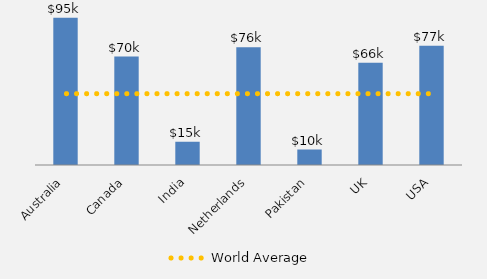
| Category | Salary By Country |
|---|---|
| Australia | 95 |
| Canada | 70 |
| India | 15 |
| Netherlands | 76 |
| Pakistan | 10 |
| UK | 66 |
| USA | 77 |